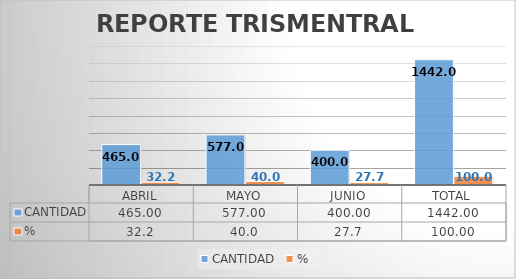
| Category | CANTIDAD | % |
|---|---|---|
| ABRIL | 465 | 32.247 |
| MAYO | 577 | 40.014 |
| JUNIO | 400 | 27.739 |
| TOTAL | 1442 | 100 |